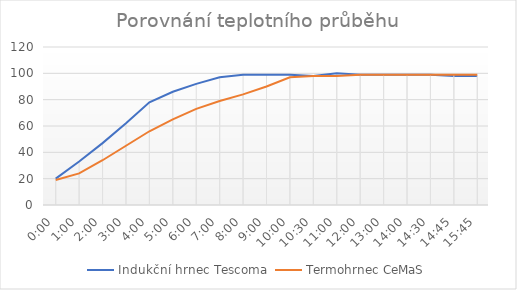
| Category | Indukční hrnec Tescoma | Termohrnec CeMaS |
|---|---|---|
| 0.0 | 20 | 19 |
| 0.041666666666666664 | 33 | 24 |
| 0.08333333333333333 | 47 | 34 |
| 0.125 | 62 | 45 |
| 0.16666666666666666 | 78 | 56 |
| 0.208333333333333 | 86 | 65 |
| 0.25 | 92 | 73 |
| 0.291666666666667 | 97 | 79 |
| 0.333333333333333 | 99 | 84 |
| 0.375 | 99 | 90 |
| 0.416666666666667 | 99 | 97 |
| 0.4375 | 98 | 98 |
| 0.458333333333333 | 100 | 98 |
| 0.5 | 99 | 99 |
| 0.541666666666667 | 99 | 99 |
| 0.583333333333333 | 99 | 99 |
| 0.6041666666666666 | 99 | 99 |
| 0.6145833333333334 | 98 | 99 |
| 0.65625 | 98 | 99 |